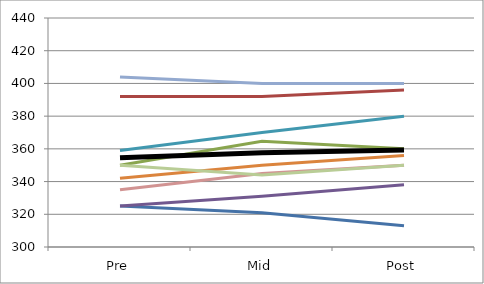
| Category | Series 0 | Series 1 | Series 2 | Series 3 | Series 4 | Series 5 | Series 6 | Series 7 | Series 8 | Mean |
|---|---|---|---|---|---|---|---|---|---|---|
| Pre | 325 | 392 | 350 | 325 | 359 | 342 | 404 | 335 | 350 | 354.6 |
| Mid | 321 | 392 | 364.583 | 331 | 370 | 350 | 400 | 345 | 344 | 357.658 |
| Post | 313 | 396 | 360 | 338 | 380 | 356 | 400 | 350 | 350 | 359.3 |